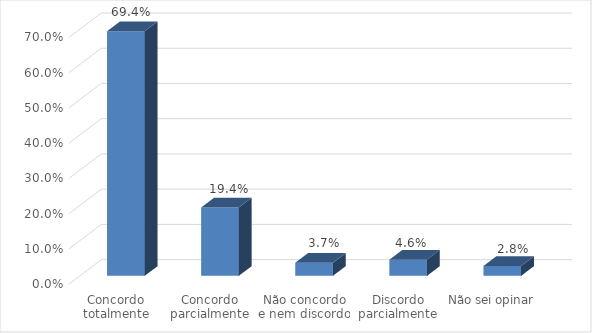
| Category | Series 0 |
|---|---|
| Concordo totalmente | 0.694 |
| Concordo parcialmente | 0.194 |
| Não concordo e nem discordo | 0.037 |
| Discordo parcialmente | 0.046 |
| Não sei opinar | 0.028 |